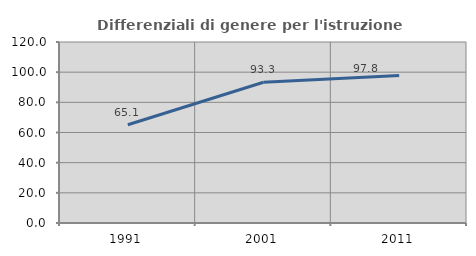
| Category | Differenziali di genere per l'istruzione superiore |
|---|---|
| 1991.0 | 65.103 |
| 2001.0 | 93.287 |
| 2011.0 | 97.821 |